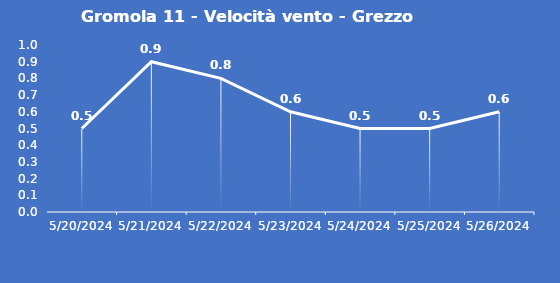
| Category | Gromola 11 - Velocità vento - Grezzo (m/s) |
|---|---|
| 5/20/24 | 0.5 |
| 5/21/24 | 0.9 |
| 5/22/24 | 0.8 |
| 5/23/24 | 0.6 |
| 5/24/24 | 0.5 |
| 5/25/24 | 0.5 |
| 5/26/24 | 0.6 |